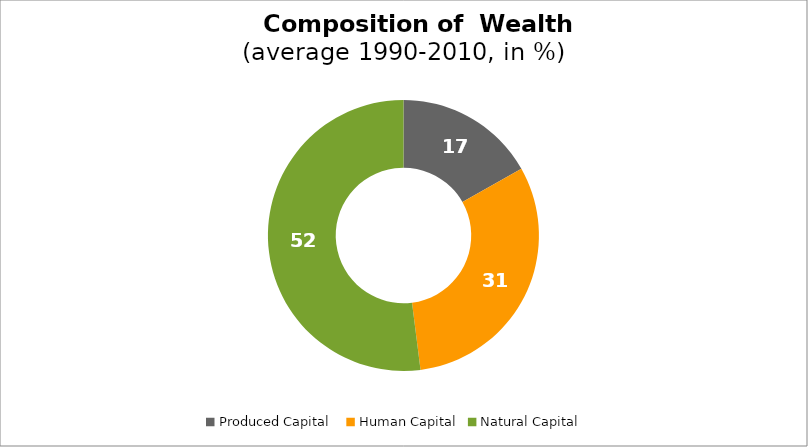
| Category | Series 0 |
|---|---|
| Produced Capital  | 16.791 |
| Human Capital | 31.201 |
| Natural Capital | 52.008 |